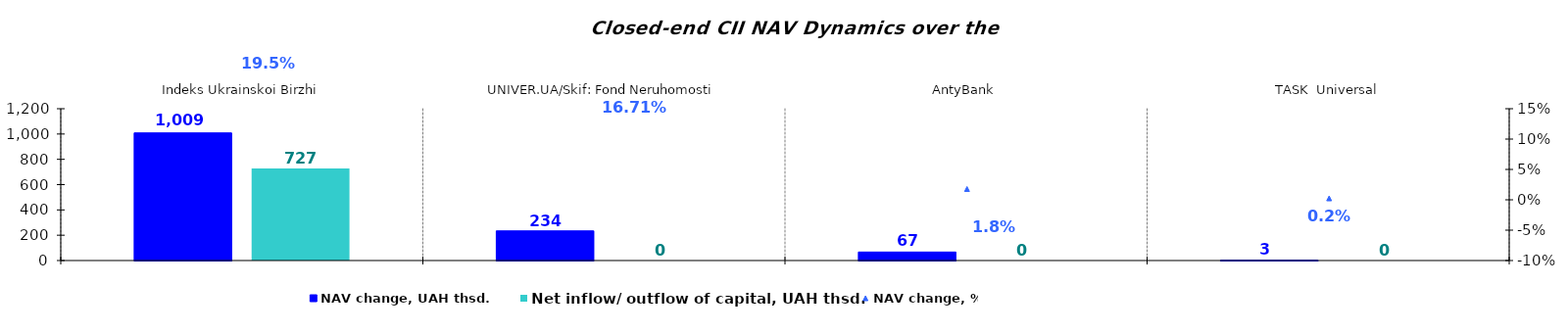
| Category | NAV change, UAH thsd. | Net inflow/ outflow of capital, UAH thsd. |
|---|---|---|
| Indeks Ukrainskoi Birzhi | 1008.903 | 726.843 |
| UNIVER.UA/Skif: Fond Neruhomosti | 234.344 | 0 |
| AntyBank | 67.208 | 0 |
| TASK  Universal | 2.551 | 0 |